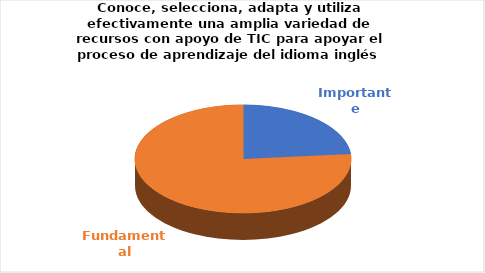
| Category | Series 0 |
|---|---|
| Importante | 4 |
| Fundamental | 13 |